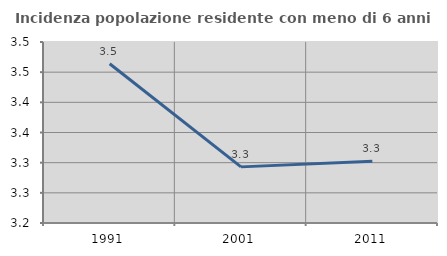
| Category | Incidenza popolazione residente con meno di 6 anni |
|---|---|
| 1991.0 | 3.464 |
| 2001.0 | 3.293 |
| 2011.0 | 3.302 |